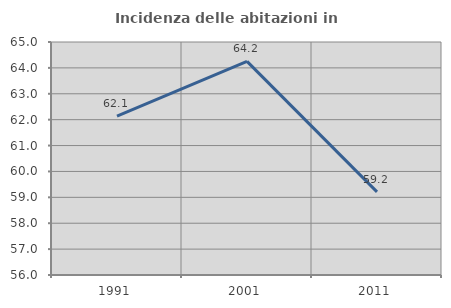
| Category | Incidenza delle abitazioni in proprietà  |
|---|---|
| 1991.0 | 62.132 |
| 2001.0 | 64.25 |
| 2011.0 | 59.213 |